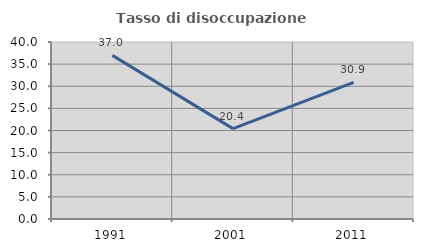
| Category | Tasso di disoccupazione giovanile  |
|---|---|
| 1991.0 | 36.984 |
| 2001.0 | 20.423 |
| 2011.0 | 30.867 |